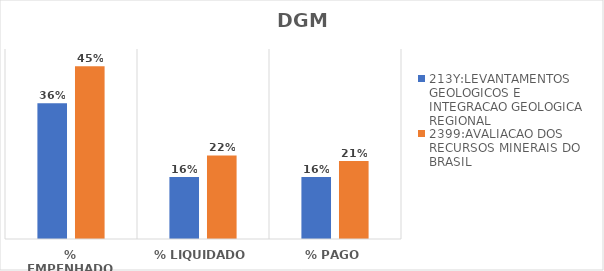
| Category | 213Y:LEVANTAMENTOS GEOLOGICOS E INTEGRACAO GEOLOGICA REGIONAL | 2399:AVALIACAO DOS RECURSOS MINERAIS DO BRASIL |
|---|---|---|
| % EMPENHADO | 0.357 | 0.455 |
| % LIQUIDADO | 0.163 | 0.22 |
| % PAGO | 0.163 | 0.205 |